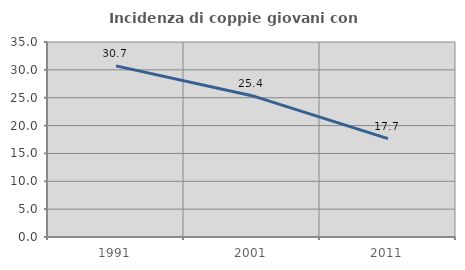
| Category | Incidenza di coppie giovani con figli |
|---|---|
| 1991.0 | 30.71 |
| 2001.0 | 25.363 |
| 2011.0 | 17.66 |